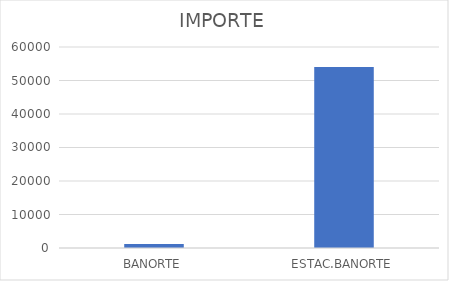
| Category | IMPORTE |
|---|---|
| BANORTE | 1173.3 |
| ESTAC.BANORTE | 54031 |